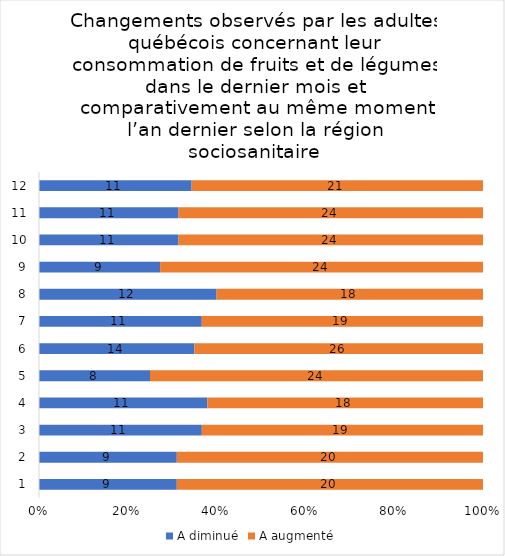
| Category | A diminué | A augmenté |
|---|---|---|
| 0 | 9 | 20 |
| 1 | 9 | 20 |
| 2 | 11 | 19 |
| 3 | 11 | 18 |
| 4 | 8 | 24 |
| 5 | 14 | 26 |
| 6 | 11 | 19 |
| 7 | 12 | 18 |
| 8 | 9 | 24 |
| 9 | 11 | 24 |
| 10 | 11 | 24 |
| 11 | 11 | 21 |